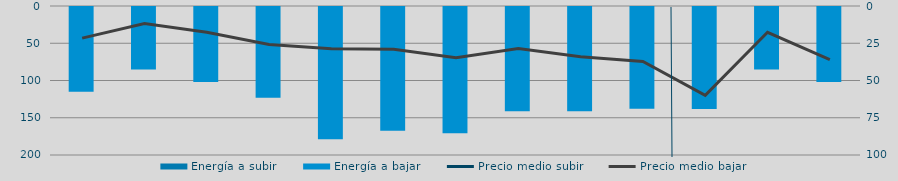
| Category | Energía a subir | Energía a bajar |
|---|---|---|
| D |  | 115.196 |
| E |  | 85.375 |
| F |  | 101.923 |
| M |  | 123.137 |
| A |  | 178.975 |
| M |  | 167.321 |
| J |  | 170.789 |
| J |  | 141.32 |
| A |  | 141.434 |
| S |  | 138.077 |
| O |  | 138.335 |
| N |  | 85.107 |
| D |  | 101.943 |